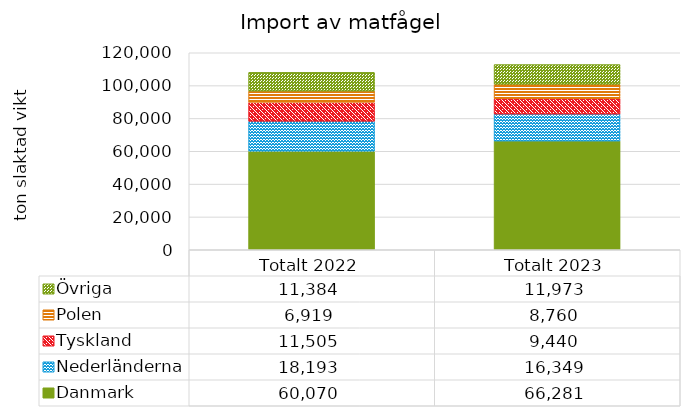
| Category | Danmark | Nederländerna | Tyskland | Polen | Övriga |
|---|---|---|---|---|---|
| Totalt 2022 | 60069.9 | 18192.85 | 11504.62 | 6919.02 | 11383.93 |
| Totalt 2023 | 66281.16 | 16348.56 | 9439.52 | 8760.22 | 11972.53 |